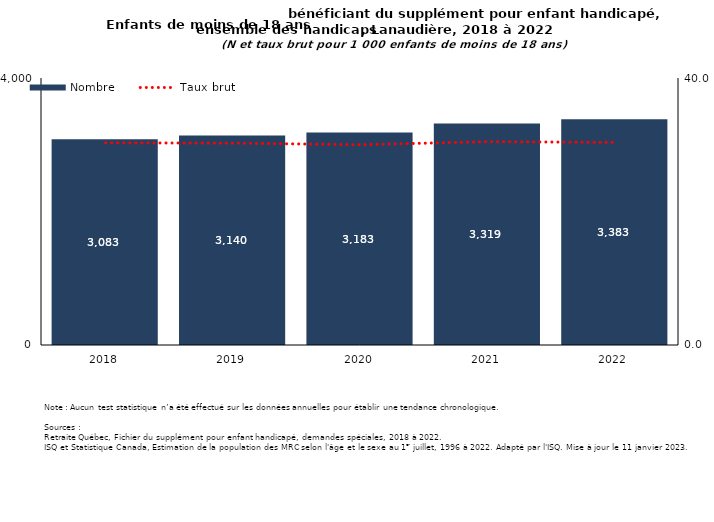
| Category | Nombre |
|---|---|
| 2018.0 | 3083 |
| 2019.0 | 3140 |
| 2020.0 | 3183 |
| 2021.0 | 3319 |
| 2022.0 | 3383 |